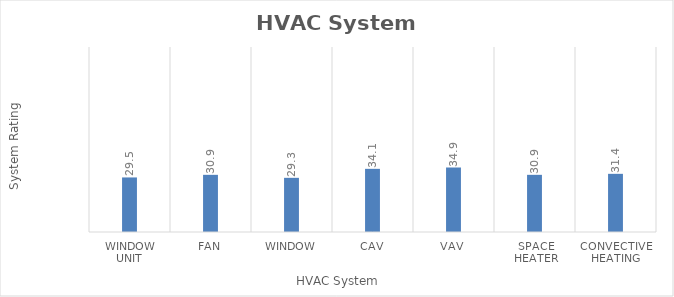
| Category | Series 0 |
|---|---|
| Window Unit | 29.49 |
| Fan | 30.9 |
| Window | 29.28 |
| CAV | 34.14 |
| VAV | 34.86 |
| Space Heater | 30.9 |
| Convective Heating | 31.44 |